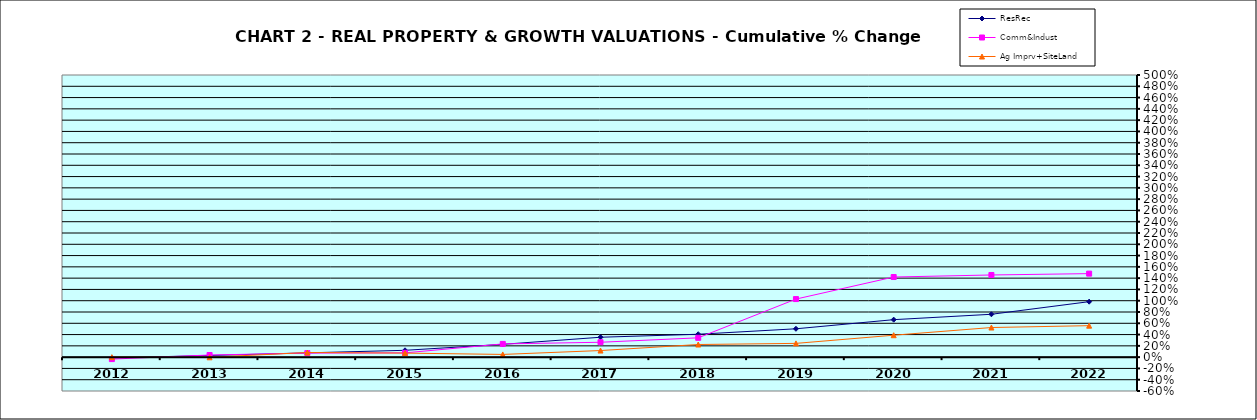
| Category | ResRec | Comm&Indust | Ag Imprv+SiteLand |
|---|---|---|---|
| 2012.0 | -0.013 | -0.034 | 0 |
| 2013.0 | 0.029 | 0.038 | -0.003 |
| 2014.0 | 0.076 | 0.072 | 0.082 |
| 2015.0 | 0.121 | 0.076 | 0.072 |
| 2016.0 | 0.227 | 0.234 | 0.048 |
| 2017.0 | 0.353 | 0.264 | 0.117 |
| 2018.0 | 0.406 | 0.342 | 0.224 |
| 2019.0 | 0.503 | 1.029 | 0.244 |
| 2020.0 | 0.664 | 1.42 | 0.389 |
| 2021.0 | 0.76 | 1.456 | 0.525 |
| 2022.0 | 0.983 | 1.48 | 0.558 |